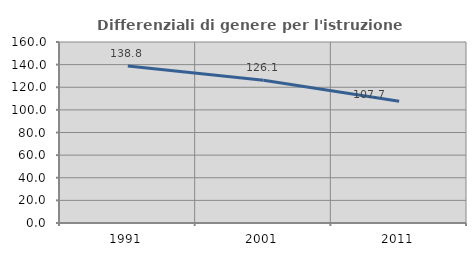
| Category | Differenziali di genere per l'istruzione superiore |
|---|---|
| 1991.0 | 138.844 |
| 2001.0 | 126.13 |
| 2011.0 | 107.658 |